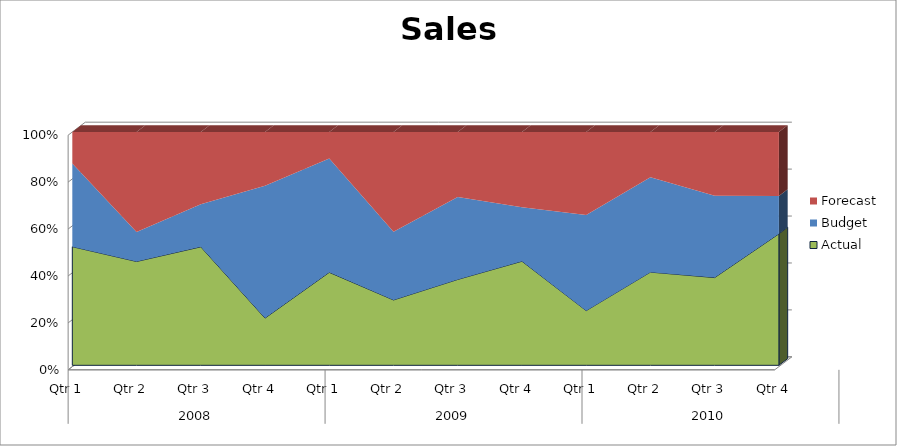
| Category | Actual | Budget | Forecast |
|---|---|---|---|
| 0 | 3430 | 2380 | 900 |
| 1 | 3280 | 920 | 3120 |
| 2 | 3400 | 1210 | 2050 |
| 3 | 840 | 2290 | 930 |
| 4 | 2250 | 2720 | 630 |
| 5 | 2100 | 2150 | 3140 |
| 6 | 3010 | 2850 | 2240 |
| 7 | 2340 | 1200 | 1670 |
| 8 | 1910 | 3260 | 2830 |
| 9 | 2900 | 2910 | 1390 |
| 10 | 3420 | 3140 | 2450 |
| 11 | 3300 | 940 | 1590 |